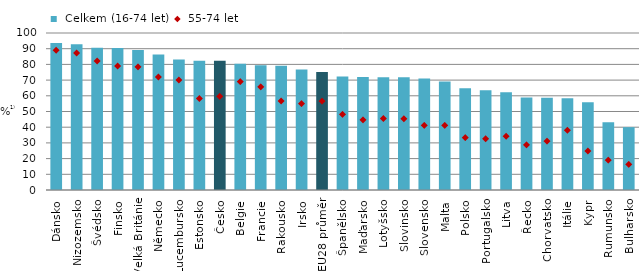
| Category |  Celkem (16-74 let) |
|---|---|
| Dánsko | 93.567 |
| Nizozemsko | 92.794 |
| Švédsko | 90.668 |
| Finsko | 90.44 |
| Velká Británie | 89.225 |
| Německo | 86.288 |
| Lucembursko | 83.047 |
| Estonsko | 82.385 |
| Česko | 82.294 |
| Belgie | 80.453 |
| Francie | 79.398 |
| Rakousko | 79.075 |
| Irsko | 76.684 |
| EU28 průměr | 75.212 |
| Španělsko | 72.247 |
| Maďarsko | 72.008 |
| Lotyšsko | 71.86 |
| Slovinsko | 71.754 |
| Slovensko | 70.946 |
| Malta | 69.087 |
| Polsko | 64.822 |
| Portugalsko | 63.598 |
| Litva | 62.255 |
| Řecko | 58.936 |
| Chorvatsko | 58.777 |
| Itálie | 58.504 |
| Kypr | 55.908 |
| Rumunsko | 43.118 |
| Bulharsko | 40.025 |